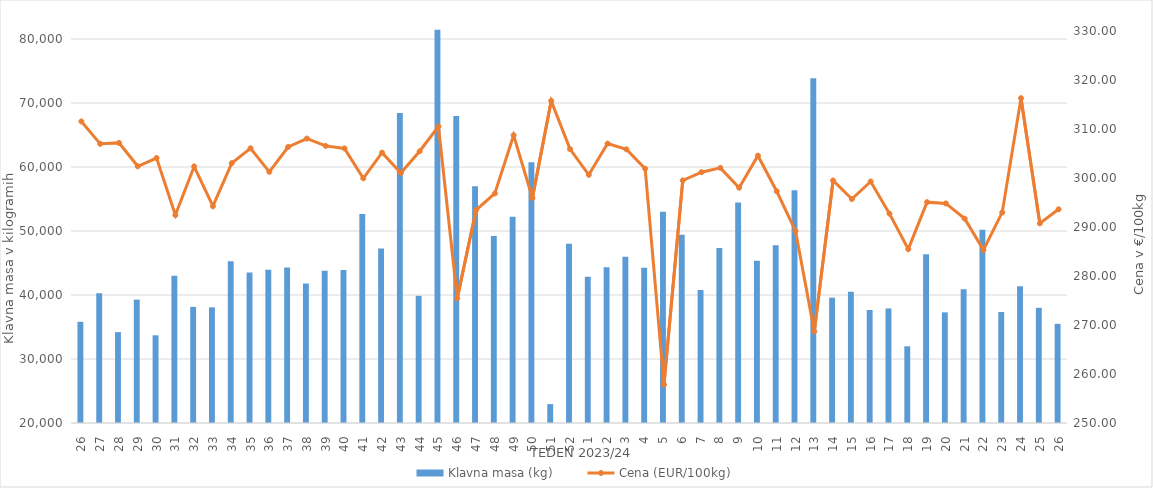
| Category | Klavna masa (kg) |
|---|---|
| 26.0 | 35812 |
| 27.0 | 40280 |
| 28.0 | 34201 |
| 29.0 | 39279 |
| 30.0 | 33702 |
| 31.0 | 43020 |
| 32.0 | 38146 |
| 33.0 | 38070 |
| 34.0 | 45290 |
| 35.0 | 43513 |
| 36.0 | 43945 |
| 37.0 | 44302 |
| 38.0 | 41798 |
| 39.0 | 43790 |
| 40.0 | 43913 |
| 41.0 | 52663 |
| 42.0 | 47275 |
| 43.0 | 68419 |
| 44.0 | 39872 |
| 45.0 | 81439 |
| 46.0 | 67983 |
| 47.0 | 57006 |
| 48.0 | 49204 |
| 49.0 | 52219 |
| 50.0 | 60759 |
| 51.0 | 22954 |
| 52.0 | 48002 |
| 1.0 | 42866 |
| 2.0 | 44318 |
| 3.0 | 45969 |
| 4.0 | 44266 |
| 5.0 | 52991 |
| 6.0 | 49406 |
| 7.0 | 40769 |
| 8.0 | 47349 |
| 9.0 | 54448 |
| 10.0 | 45343 |
| 11.0 | 47770 |
| 12.0 | 56370 |
| 13.0 | 73886 |
| 14.0 | 39581 |
| 15.0 | 40490 |
| 16.0 | 37654 |
| 17.0 | 37894 |
| 18.0 | 31981 |
| 19.0 | 46375 |
| 20.0 | 37290 |
| 21.0 | 40893 |
| 22.0 | 50178 |
| 23.0 | 37338 |
| 24.0 | 41348 |
| 25.0 | 37999 |
| 26.0 | 35494 |